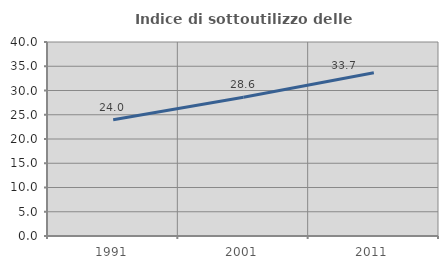
| Category | Indice di sottoutilizzo delle abitazioni  |
|---|---|
| 1991.0 | 23.964 |
| 2001.0 | 28.628 |
| 2011.0 | 33.656 |